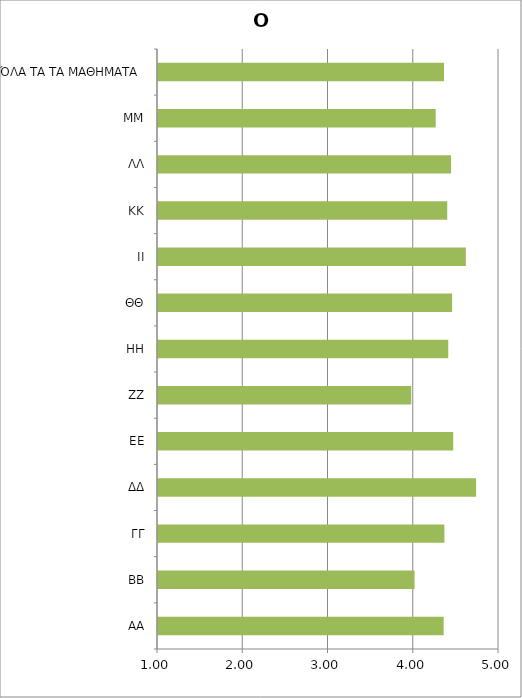
| Category | Ο Διδάσκων |
|---|---|
| ΑΑ | 4.351 |
| ΒΒ | 4.009 |
| ΓΓ | 4.36 |
| ΔΔ | 4.731 |
| ΕΕ | 4.463 |
| ΖΖ | 3.971 |
| ΗΗ | 4.405 |
| ΘΘ | 4.45 |
| ΙΙ | 4.611 |
| ΚΚ | 4.393 |
| ΛΛ | 4.438 |
| ΜΜ | 4.258 |
| ΌΛΑ ΤΑ ΤΑ ΜΑΘΗΜΑΤΑ  | 4.355 |